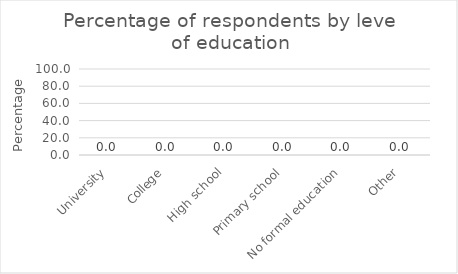
| Category | Series 0 |
|---|---|
| University | 0 |
| College | 0 |
| High school | 0 |
| Primary school | 0 |
| No formal education | 0 |
| Other | 0 |